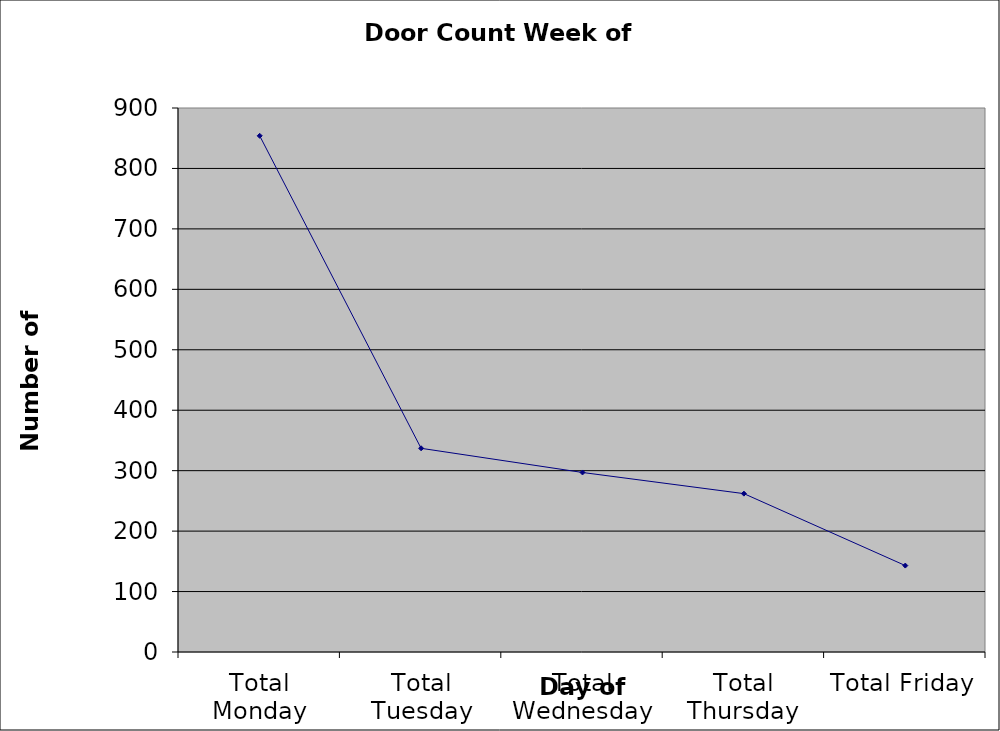
| Category | Series 0 |
|---|---|
| Total Monday | 854 |
| Total Tuesday | 337 |
| Total Wednesday | 297 |
| Total Thursday | 262 |
| Total Friday | 143 |